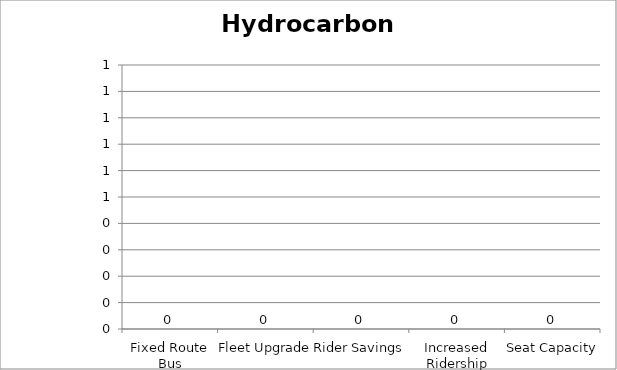
| Category | Hydrocarbons |
|---|---|
| Fixed Route Bus | 0 |
| Fleet Upgrade | 0 |
| Rider Savings | 0 |
| Increased Ridership | 0 |
| Seat Capacity | 0 |